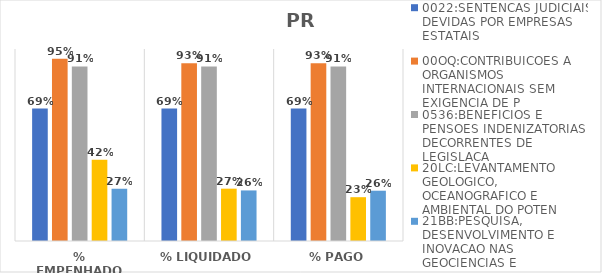
| Category | 0022:SENTENCAS JUDICIAIS DEVIDAS POR EMPRESAS ESTATAIS | 00OQ:CONTRIBUICOES A ORGANISMOS INTERNACIONAIS SEM EXIGENCIA DE P | 0536:BENEFICIOS E PENSOES INDENIZATORIAS DECORRENTES DE LEGISLACA | 20LC:LEVANTAMENTO GEOLOGICO, OCEANOGRAFICO E AMBIENTAL DO POTEN | 21BB:PESQUISA, DESENVOLVIMENTO E INOVACAO NAS GEOCIENCIAS E |
|---|---|---|---|---|---|
| % EMPENHADO | 0.69 | 0.95 | 0.909 | 0.423 | 0.273 |
| % LIQUIDADO | 0.69 | 0.926 | 0.909 | 0.273 | 0.263 |
| % PAGO | 0.69 | 0.926 | 0.909 | 0.228 | 0.262 |